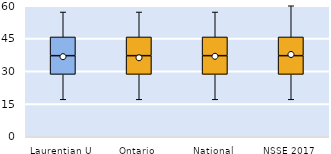
| Category | 25th | 50th | 75th |
|---|---|---|---|
| Laurentian U | 28.571 | 8.571 | 8.571 |
| Ontario | 28.571 | 8.571 | 8.571 |
| National | 28.571 | 8.571 | 8.571 |
| NSSE 2017 | 28.571 | 8.571 | 8.571 |